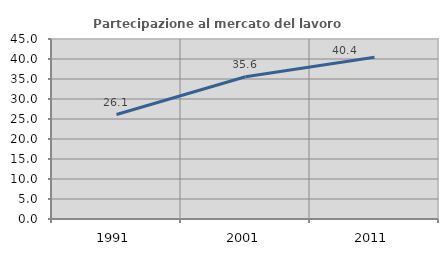
| Category | Partecipazione al mercato del lavoro  femminile |
|---|---|
| 1991.0 | 26.119 |
| 2001.0 | 35.556 |
| 2011.0 | 40.446 |